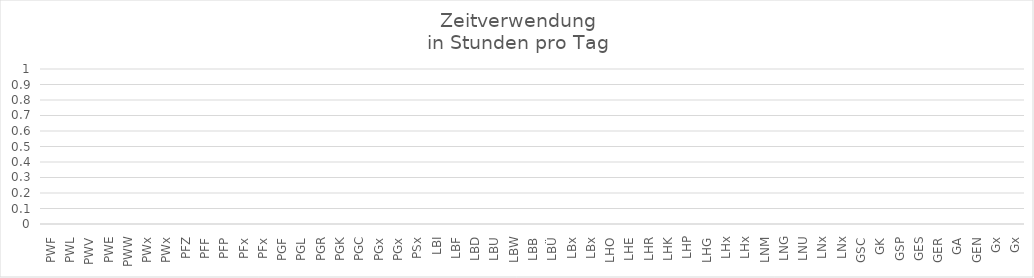
| Category | Series 0 |
|---|---|
| PWF | 0 |
| PWL | 0 |
| PWV | 0 |
| PWE | 0 |
| PWW | 0 |
| PWx | 0 |
| PWx | 0 |
| PFZ | 0 |
| PFF | 0 |
| PFP | 0 |
| PFx | 0 |
| PFx | 0 |
| PGF | 0 |
| PGL | 0 |
| PGR | 0 |
| PGK | 0 |
| PGC | 0 |
| PGx | 0 |
| PGx | 0 |
| PSx | 0 |
| LBI | 0 |
| LBF | 0 |
| LBD | 0 |
| LBU | 0 |
| LBW | 0 |
| LBB | 0 |
| LBÜ | 0 |
| LBx | 0 |
| LBx | 0 |
| LHO | 0 |
| LHE | 0 |
| LHR | 0 |
| LHK | 0 |
| LHP | 0 |
| LHG | 0 |
| LHx | 0 |
| LHx | 0 |
| LNM | 0 |
| LNG | 0 |
| LNU | 0 |
| LNx | 0 |
| LNx | 0 |
| GSC | 0 |
| GK | 0 |
| GSP | 0 |
| GES | 0 |
| GER | 0 |
| GA | 0 |
| GEN | 0 |
| Gx | 0 |
| Gx | 0 |